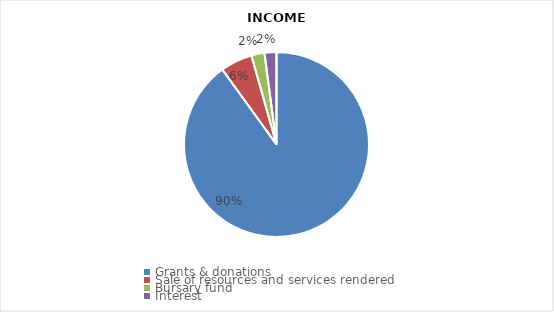
| Category | Series 0 | Series 1 |
|---|---|---|
| Grants & donations | 7887348 | 7887348 |
| Sale of resources and services rendered | 489604 | 489604 |
| Bursary fund | 200000 | 200000 |
| Interest | 182927 | 182927 |